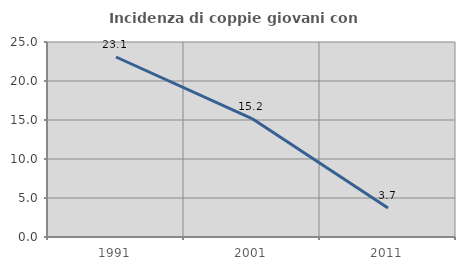
| Category | Incidenza di coppie giovani con figli |
|---|---|
| 1991.0 | 23.077 |
| 2001.0 | 15.19 |
| 2011.0 | 3.704 |